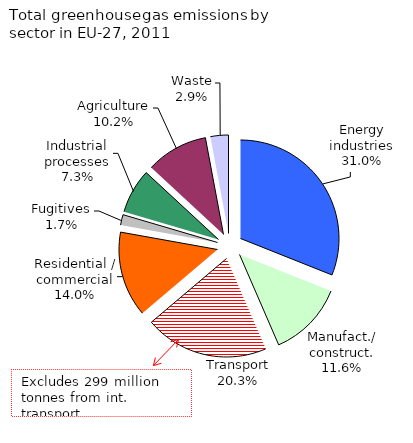
| Category | Series 0 |
|---|---|
| Energy industries | 1406087.365 |
| Manufact. / construction | 564004.717 |
| Transport | 920553.3 |
| Residential / commercial | 635106.604 |
| Fugitives | 78346.611 |
| Industrial processes | 331684.664 |
| Agriculture | 461012.993 |
| Waste | 133432.908 |